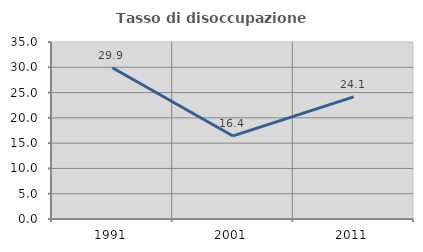
| Category | Tasso di disoccupazione giovanile  |
|---|---|
| 1991.0 | 29.919 |
| 2001.0 | 16.425 |
| 2011.0 | 24.138 |